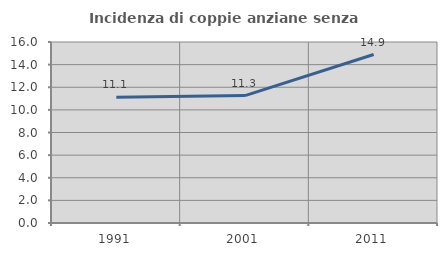
| Category | Incidenza di coppie anziane senza figli  |
|---|---|
| 1991.0 | 11.111 |
| 2001.0 | 11.261 |
| 2011.0 | 14.894 |